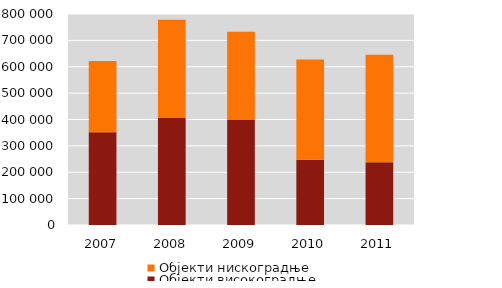
| Category | Објекти високоградње | Објекти нискоградње |
|---|---|---|
| 2007.0 | 351553 | 270315 |
| 2008.0 | 406004 | 372317 |
| 2009.0 | 398316 | 334422 |
| 2010.0 | 247583 | 379945 |
| 2011.0 | 238093 | 407161 |